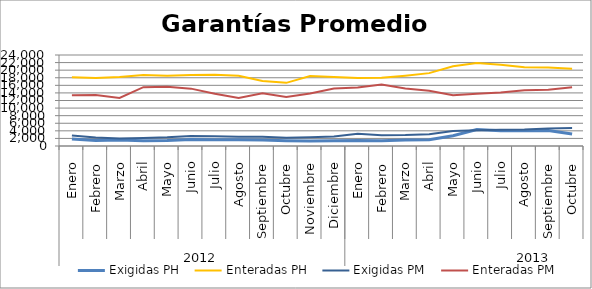
| Category | Exigidas PH | Enteradas PH | Exigidas PM | Enteradas PM |
|---|---|---|---|---|
| 0 | 1828.564 | 18155.583 | 2744.93 | 13413.991 |
| 1 | 1451.155 | 17917.734 | 2215.902 | 13440.832 |
| 2 | 1587.31 | 18166.129 | 1968.766 | 12673.714 |
| 3 | 1353.003 | 18741.256 | 2118.782 | 15515.723 |
| 4 | 1464.668 | 18540.927 | 2278.002 | 15625.393 |
| 5 | 1719.43 | 18734.539 | 2626.915 | 15127.903 |
| 6 | 1674.023 | 18761.463 | 2556.575 | 13766.49 |
| 7 | 1647.243 | 18544.546 | 2463.76 | 12637.427 |
| 8 | 1556.152 | 17124.972 | 2459.803 | 13929.715 |
| 9 | 1402.926 | 16653.067 | 2169.047 | 12937.81 |
| 10 | 1329.011 | 18467.462 | 2322.009 | 13825.53 |
| 11 | 1379.519 | 18204.98 | 2522.413 | 15188.776 |
| 12 | 1462.675 | 17957.148 | 3246.817 | 15415.235 |
| 13 | 1398.609 | 17993.637 | 2845.352 | 16230.589 |
| 14 | 1589.589 | 18548.479 | 2894.834 | 15192.36 |
| 15 | 1623.519 | 19220.98 | 3086.854 | 14555.102 |
| 16 | 2700.009 | 21053.59 | 3968.296 | 13386.678 |
| 17 | 4335.591 | 21872.028 | 4126.324 | 13759.513 |
| 18 | 4053.78 | 21401.693 | 4283.155 | 14110.316 |
| 19 | 4016.859 | 20783.858 | 4341.698 | 14691.614 |
| 20 | 4109.679 | 20689.944 | 4647.813 | 14857.936 |
| 21 | 3158.931 | 20386.396 | 4756.737 | 15467.175 |